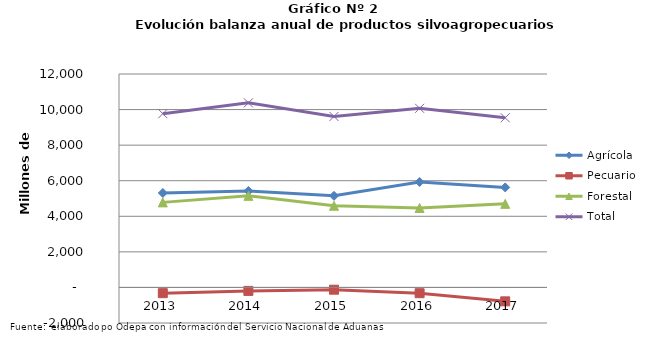
| Category | Agrícola | Pecuario | Forestal | Total |
|---|---|---|---|---|
| 2013.0 | 5309603 | -322473 | 4781973 | 9769103 |
| 2014.0 | 5424524 | -195643 | 5149868 | 10378749 |
| 2015.0 | 5149872 | -127785 | 4591408 | 9613495 |
| 2016.0 | 5928552 | -325380 | 4468104 | 10071276 |
| 2017.0 | 5622734 | -782960 | 4700192 | 9539966 |